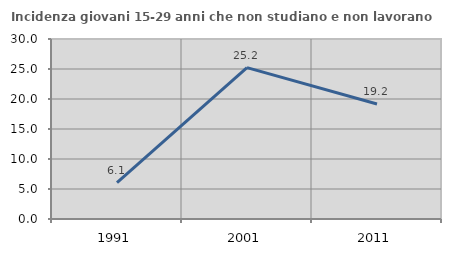
| Category | Incidenza giovani 15-29 anni che non studiano e non lavorano  |
|---|---|
| 1991.0 | 6.061 |
| 2001.0 | 25.225 |
| 2011.0 | 19.178 |